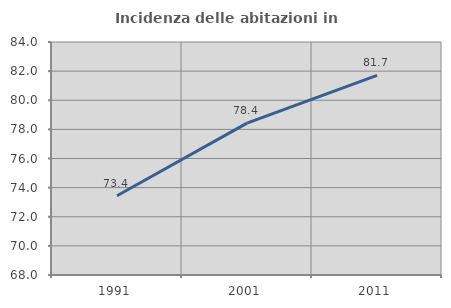
| Category | Incidenza delle abitazioni in proprietà  |
|---|---|
| 1991.0 | 73.446 |
| 2001.0 | 78.431 |
| 2011.0 | 81.713 |